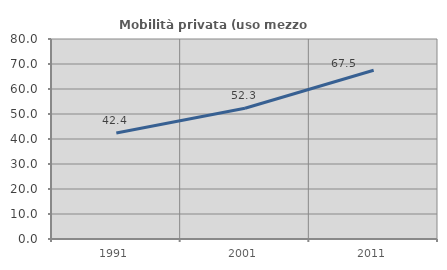
| Category | Mobilità privata (uso mezzo privato) |
|---|---|
| 1991.0 | 42.399 |
| 2001.0 | 52.282 |
| 2011.0 | 67.525 |